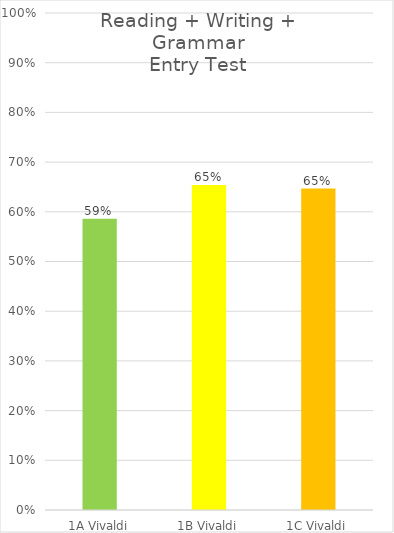
| Category | Reading + Writing + Grammar
Entry Test |
|---|---|
| 1A Vivaldi | 0.586 |
| 1B Vivaldi | 0.654 |
| 1C Vivaldi | 0.647 |